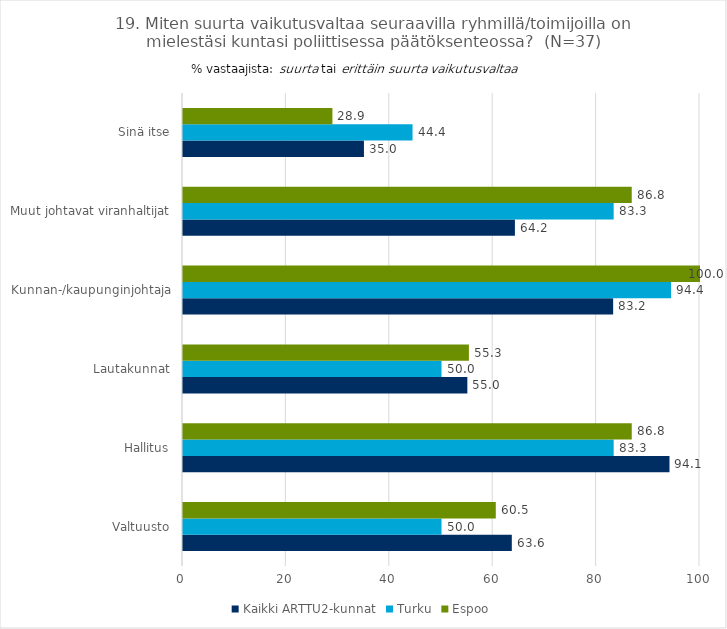
| Category | Kaikki ARTTU2-kunnat | Turku | Espoo |
|---|---|---|---|
| Valtuusto | 63.6 | 50 | 60.5 |
| Hallitus | 94.1 | 83.3 | 86.8 |
| Lautakunnat | 55 | 50 | 55.3 |
| Kunnan-/kaupunginjohtaja | 83.2 | 94.4 | 100 |
| Muut johtavat viranhaltijat | 64.2 | 83.3 | 86.8 |
| Sinä itse | 35 | 44.4 | 28.9 |